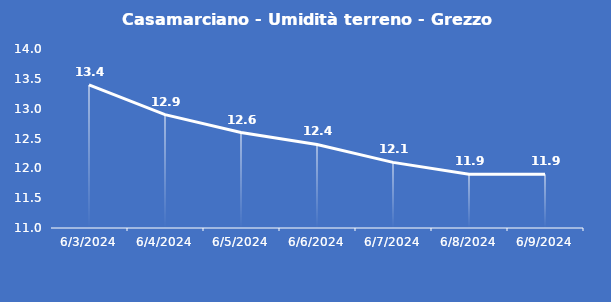
| Category | Casamarciano - Umidità terreno - Grezzo (%VWC) |
|---|---|
| 6/3/24 | 13.4 |
| 6/4/24 | 12.9 |
| 6/5/24 | 12.6 |
| 6/6/24 | 12.4 |
| 6/7/24 | 12.1 |
| 6/8/24 | 11.9 |
| 6/9/24 | 11.9 |